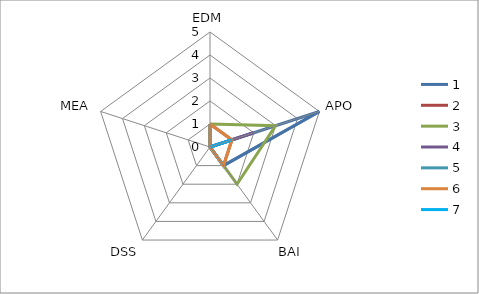
| Category | 1 | 2 | 3 | 4 | 5 | 6 | 7 |
|---|---|---|---|---|---|---|---|
| 0 | 0 | 1 | 1 | 0 | 1 | 1 | 0 |
| 1 | 5 | 1 | 3 | 2 | 0 | 1 | 1 |
| 2 | 1 | 1 | 2 | 0 | 1 | 1 | 0 |
| 3 | 0 | 0 | 0 | 0 | 0 | 0 | 0 |
| 4 | 0 | 0 | 0 | 0 | 0 | 0 | 0 |